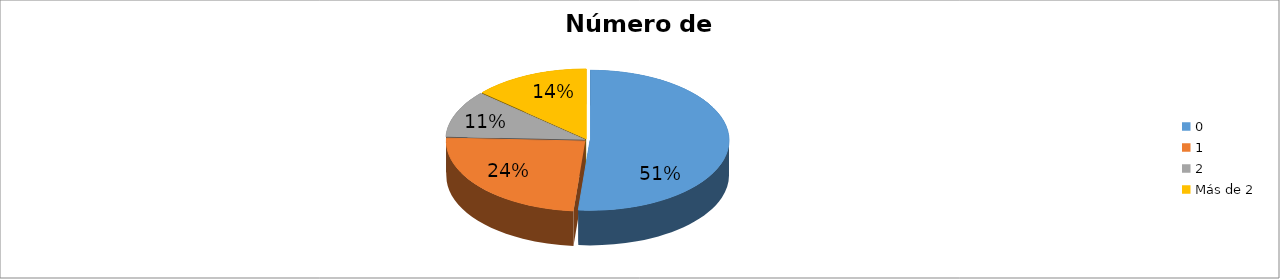
| Category | Series 0 |
|---|---|
| 0 | 0.514 |
| 1 | 0.243 |
| 2 | 0.108 |
| Más de 2 | 0.135 |